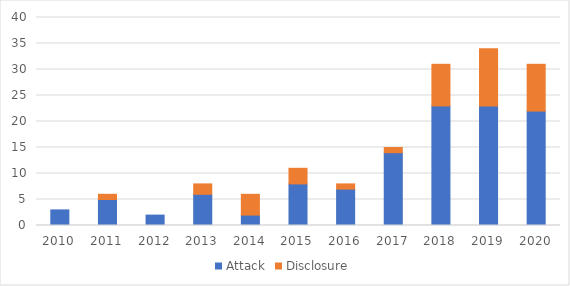
| Category | Attack | Disclosure |
|---|---|---|
| 2010.0 | 3 | 0 |
| 2011.0 | 5 | 1 |
| 2012.0 | 2 | 0 |
| 2013.0 | 6 | 2 |
| 2014.0 | 2 | 4 |
| 2015.0 | 8 | 3 |
| 2016.0 | 7 | 1 |
| 2017.0 | 14 | 1 |
| 2018.0 | 23 | 8 |
| 2019.0 | 23 | 11 |
| 2020.0 | 22 | 9 |